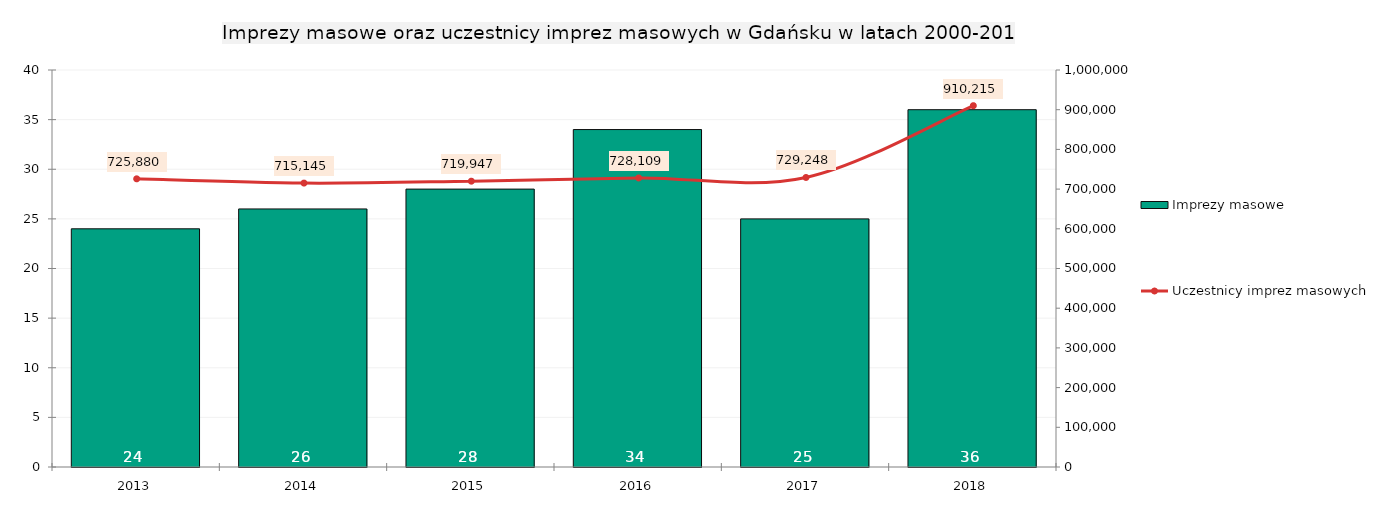
| Category | Imprezy masowe |
|---|---|
| 2013.0 | 24 |
| 2014.0 | 26 |
| 2015.0 | 28 |
| 2016.0 | 34 |
| 2017.0 | 25 |
| 2018.0 | 36 |